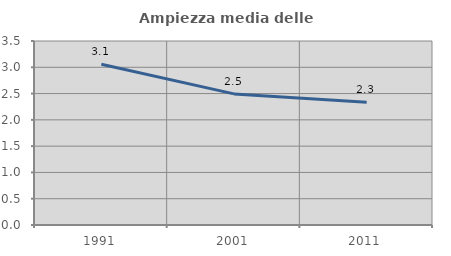
| Category | Ampiezza media delle famiglie |
|---|---|
| 1991.0 | 3.057 |
| 2001.0 | 2.494 |
| 2011.0 | 2.334 |